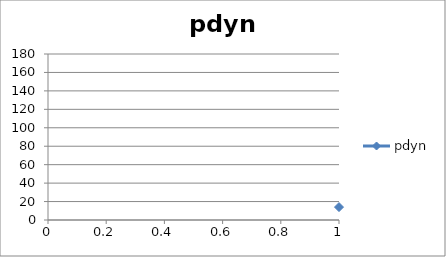
| Category | pdyn |
|---|---|
| 0 | 14 |
| 1 | 154 |
| 2 | 0 |
| 3 | 3 |
| 4 | 1 |
| 5 | 5 |
| 6 | 0 |
| 7 | 1 |
| 8 | 0 |
| 9 | 0 |
| 10 | 0 |